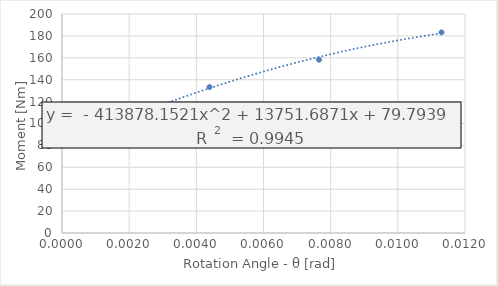
| Category | TOTAL: Torque |
|---|---|
| 0.001160193438246716 | 92.3 |
| 0.0023097071788457995 | 112.798 |
| 0.004391626199950343 | 133.296 |
| 0.007653215939068165 | 158.262 |
| 0.011300733382942255 | 183.227 |